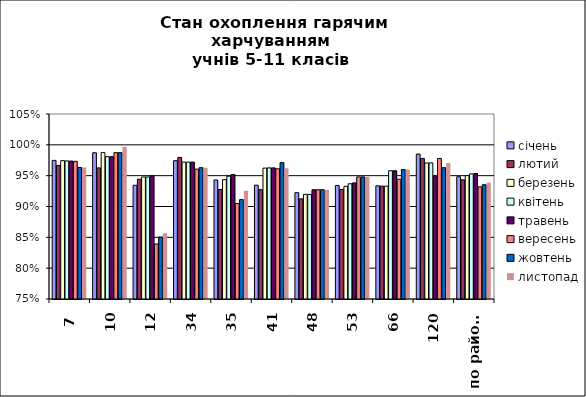
| Category | січень | лютий | березень | квітень | травень | вересень | жовтень | листопад |
|---|---|---|---|---|---|---|---|---|
| 7 | 0.975 | 0.967 | 0.974 | 0.974 | 0.974 | 0.973 | 0.963 | 0.963 |
| 10 | 0.987 | 0.963 | 0.987 | 0.981 | 0.981 | 0.987 | 0.987 | 0.997 |
| 12 | 0.934 | 0.944 | 0.948 | 0.948 | 0.95 | 0.839 | 0.85 | 0.857 |
| 34 | 0.974 | 0.98 | 0.972 | 0.972 | 0.972 | 0.961 | 0.963 | 0.963 |
| 35 | 0.943 | 0.928 | 0.944 | 0.949 | 0.952 | 0.905 | 0.911 | 0.926 |
| 41 | 0.935 | 0.927 | 0.962 | 0.963 | 0.963 | 0.961 | 0.971 | 0.962 |
| 48 | 0.922 | 0.912 | 0.92 | 0.92 | 0.927 | 0.927 | 0.927 | 0.927 |
| 53 | 0.934 | 0.928 | 0.933 | 0.937 | 0.938 | 0.948 | 0.948 | 0.948 |
| 66 | 0.934 | 0.933 | 0.933 | 0.958 | 0.958 | 0.944 | 0.96 | 0.96 |
| 120 | 0.985 | 0.978 | 0.971 | 0.971 | 0.949 | 0.978 | 0.963 | 0.97 |
| по району | 0.948 | 0.943 | 0.95 | 0.953 | 0.953 | 0.932 | 0.935 | 0.939 |